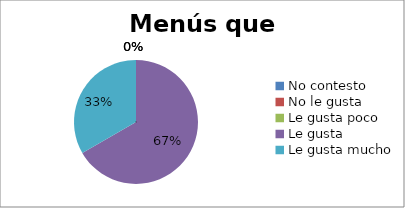
| Category | Series 0 |
|---|---|
| No contesto | 0 |
| No le gusta | 0 |
| Le gusta poco | 0 |
| Le gusta | 4 |
| Le gusta mucho | 2 |